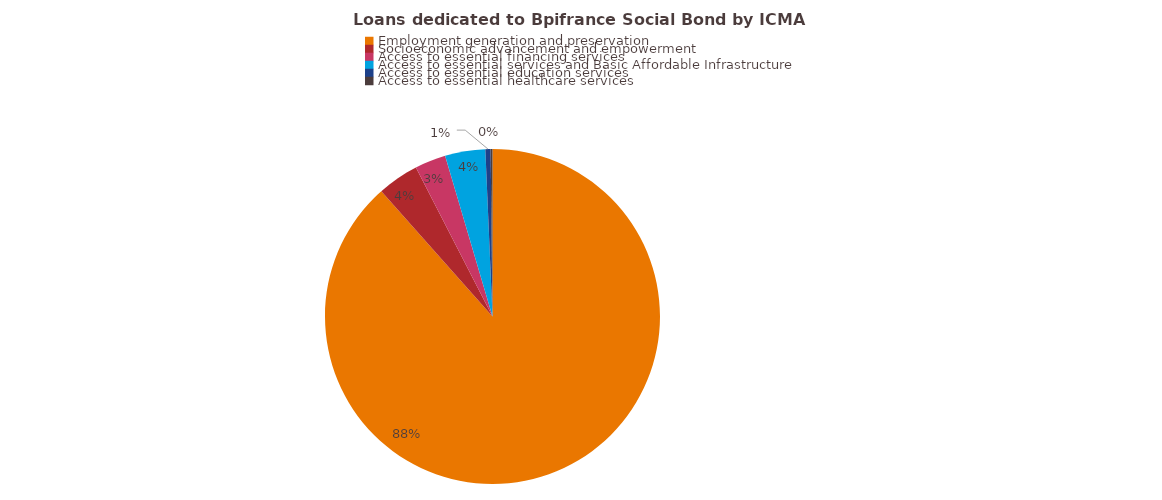
| Category | %  |
|---|---|
| Employment generation and preservation | 0.884 |
| Socioeconomic advancement and empowerment | 0.04 |
| Access to essential financing services | 0.03 |
| Access to essential services and Basic Affordable Infrastructure | 0.039 |
| Access to essential education services | 0.005 |
| Access to essential healthcare services | 0.002 |